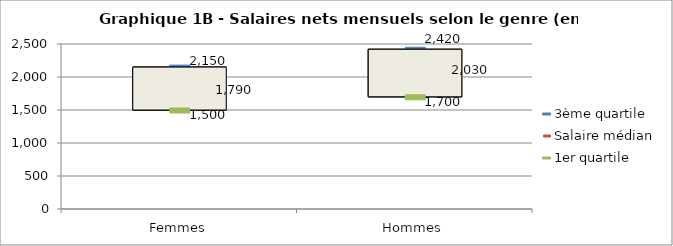
| Category | 3ème quartile | Salaire médian | 1er quartile |
|---|---|---|---|
| Femmes | 2150 | 1790 | 1500 |
| Hommes | 2420 | 2030 | 1700 |